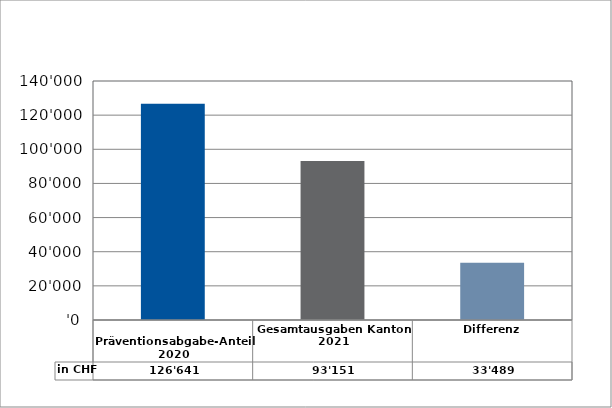
| Category | in CHF |
|---|---|
| 
Präventionsabgabe-Anteil 2020

 | 126640.6 |
| Gesamtausgaben Kanton 2021
 | 93151.4 |
| Differenz | 33489.2 |